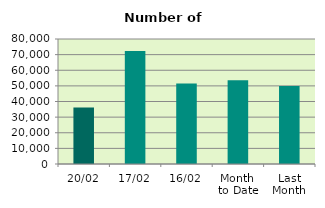
| Category | Series 0 |
|---|---|
| 20/02 | 36226 |
| 17/02 | 72366 |
| 16/02 | 51538 |
| Month 
to Date | 53644.857 |
| Last
Month | 49894.952 |